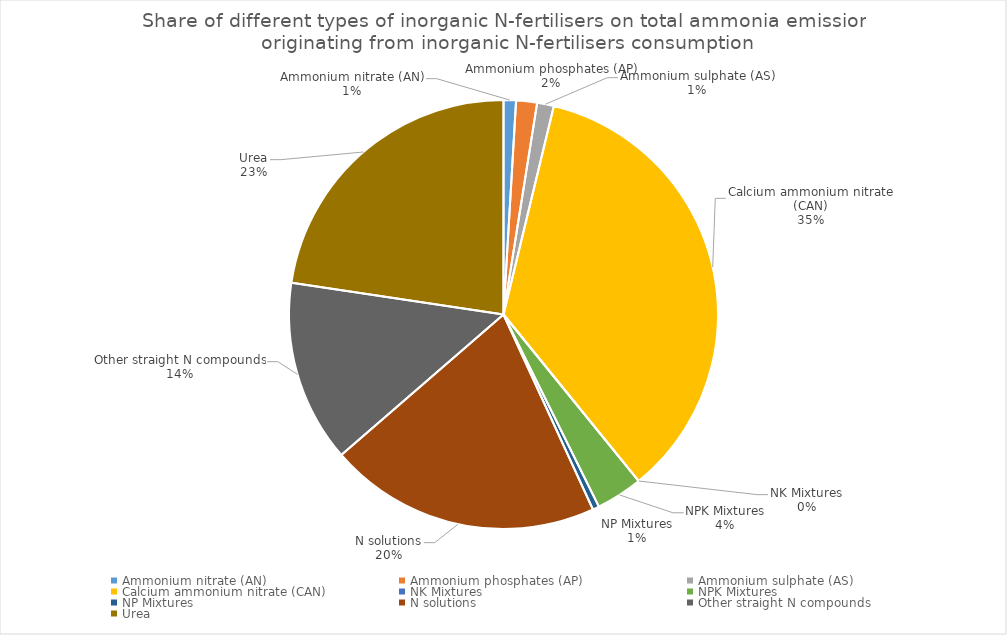
| Category | Series 0 |
|---|---|
| Ammonium nitrate (AN) | 2.838 |
| Ammonium phosphates (AP) | 4.772 |
| Ammonium sulphate (AS) | 3.817 |
| Calcium ammonium nitrate (CAN) | 107.171 |
| NK Mixtures | 0 |
| NPK Mixtures | 10.66 |
| NP Mixtures | 1.479 |
| N solutions | 62.063 |
| Other straight N compounds | 41.588 |
| Urea | 68.585 |